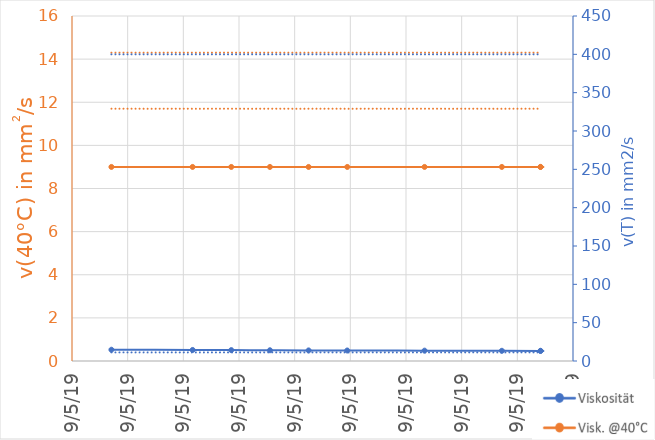
| Category | Visk. @40°C |
|---|---|
| 43594.37708333333 | 9 |
| 43594.39166666667 | 9 |
| 43594.39861111111 | 9 |
| 43594.40555555555 | 9 |
| 43594.4125 | 9 |
| 43594.419444444444 | 9 |
| 43594.433333333334 | 9 |
| 43594.447222222225 | 9 |
| 43594.45416666667 | 9 |
| 43594.45416666667 | 9 |
| nan | 0 |
| nan | 0 |
| nan | 0 |
| nan | 0 |
| nan | 0 |
| nan | 0 |
| nan | 0 |
| nan | 0 |
| nan | 0 |
| nan | 0 |
| nan | 0 |
| nan | 0 |
| nan | 0 |
| nan | 0 |
| nan | 0 |
| nan | 0 |
| nan | 0 |
| nan | 0 |
| nan | 0 |
| nan | 0 |
| nan | 0 |
| nan | 0 |
| nan | 0 |
| nan | 0 |
| nan | 0 |
| nan | 0 |
| nan | 0 |
| nan | 0 |
| nan | 0 |
| nan | 0 |
| nan | 0 |
| nan | 0 |
| nan | 0 |
| nan | 0 |
| nan | 0 |
| nan | 0 |
| nan | 0 |
| nan | 0 |
| nan | 0 |
| nan | 0 |
| nan | 0 |
| nan | 0 |
| nan | 0 |
| nan | 0 |
| nan | 0 |
| nan | 0 |
| nan | 0 |
| nan | 0 |
| nan | 0 |
| nan | 0 |
| nan | 0 |
| nan | 0 |
| nan | 0 |
| nan | 0 |
| nan | 0 |
| nan | 0 |
| nan | 0 |
| nan | 0 |
| nan | 0 |
| nan | 0 |
| nan | 0 |
| nan | 0 |
| nan | 0 |
| nan | 0 |
| nan | 0 |
| nan | 0 |
| nan | 0 |
| nan | 0 |
| nan | 0 |
| nan | 0 |
| nan | 0 |
| nan | 0 |
| nan | 0 |
| nan | 0 |
| nan | 0 |
| nan | 0 |
| nan | 0 |
| nan | 0 |
| nan | 0 |
| nan | 0 |
| nan | 0 |
| nan | 0 |
| nan | 0 |
| nan | 0 |
| nan | 0 |
| nan | 0 |
| nan | 0 |
| nan | 0 |
| nan | 0 |
| nan | 0 |